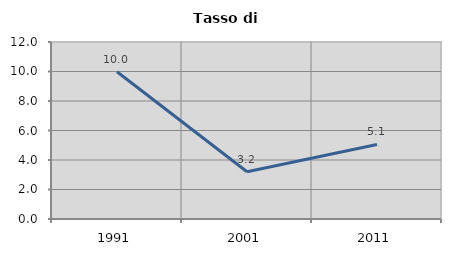
| Category | Tasso di disoccupazione   |
|---|---|
| 1991.0 | 9.981 |
| 2001.0 | 3.206 |
| 2011.0 | 5.053 |